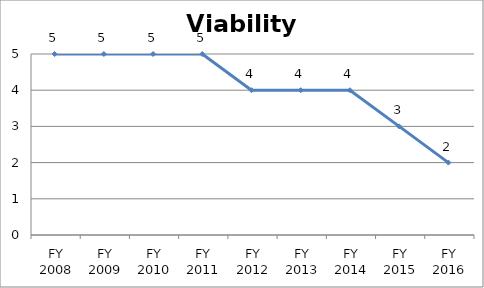
| Category | Viability score |
|---|---|
| FY 2016 | 2 |
| FY 2015 | 3 |
| FY 2014 | 4 |
| FY 2013 | 4 |
| FY 2012 | 4 |
| FY 2011 | 5 |
| FY 2010 | 5 |
| FY 2009 | 5 |
| FY 2008 | 5 |